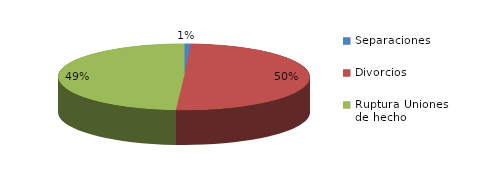
| Category | Series 0 |
|---|---|
| Separaciones | 7 |
| Divorcios | 397 |
| Ruptura Uniones de hecho | 388 |